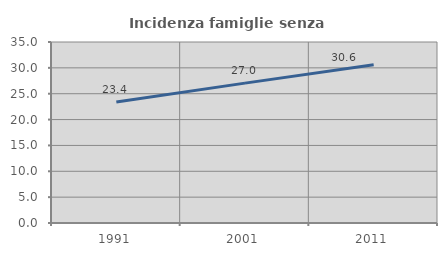
| Category | Incidenza famiglie senza nuclei |
|---|---|
| 1991.0 | 23.381 |
| 2001.0 | 27.046 |
| 2011.0 | 30.598 |